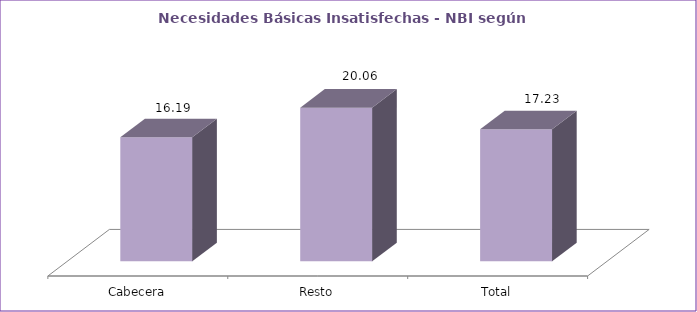
| Category | Series 0 |
|---|---|
| Cabecera | 16.19 |
| Resto | 20.06 |
| Total | 17.23 |